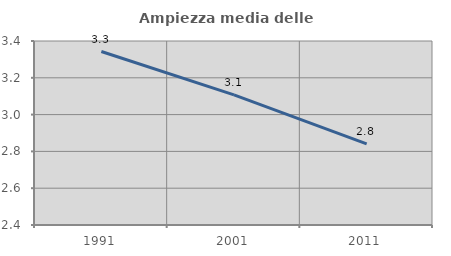
| Category | Ampiezza media delle famiglie |
|---|---|
| 1991.0 | 3.343 |
| 2001.0 | 3.108 |
| 2011.0 | 2.84 |